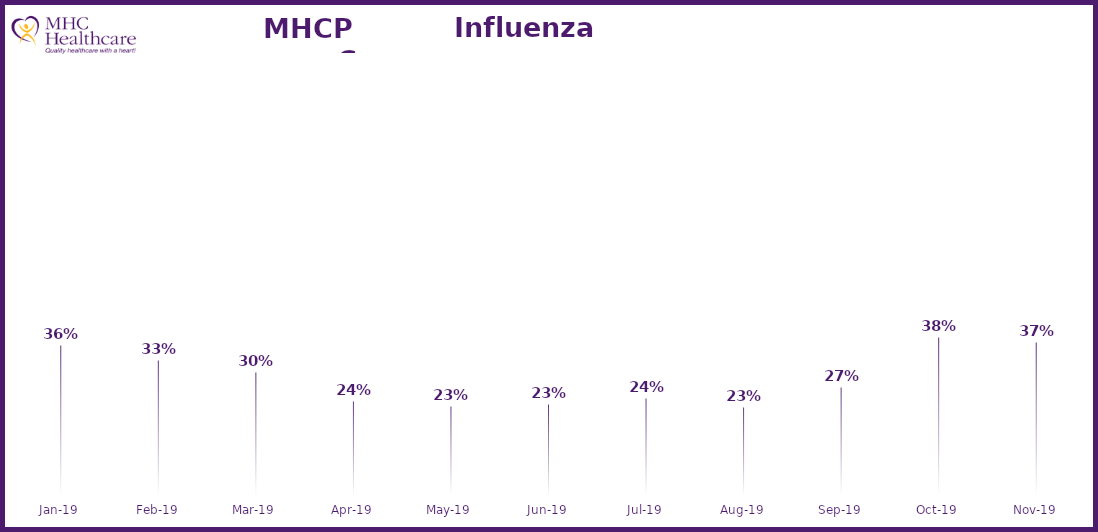
| Category | Online Access to Health Information |
|---|---|
| 2019-01-01 | 0.365 |
| 2019-02-01 | 0.332 |
| 2019-03-01 | 0.304 |
| 2019-04-01 | 0.239 |
| 2019-05-01 | 0.227 |
| 2019-06-01 | 0.233 |
| 2019-07-01 | 0.245 |
| 2019-08-01 | 0.226 |
| 2019-09-01 | 0.269 |
| 2019-10-01 | 0.383 |
| 2019-11-01 | 0.372 |